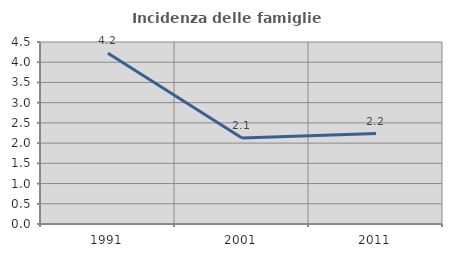
| Category | Incidenza delle famiglie numerose |
|---|---|
| 1991.0 | 4.22 |
| 2001.0 | 2.127 |
| 2011.0 | 2.235 |